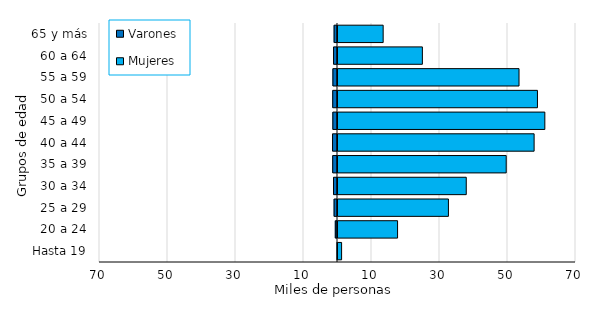
| Category | Varones | Mujeres |
|---|---|---|
| Hasta 19 | -102 | 1352 |
| 20 a 24 | -644 | 17815 |
| 25 a 29 | -1000 | 32773 |
| 30 a 34 | -1168 | 38016 |
| 35 a 39 | -1407 | 49768 |
| 40 a 44 | -1454 | 57976 |
| 45 a 49 | -1366 | 61128 |
| 50 a 54 | -1399 | 58961 |
| 55 a 59 | -1351 | 53535 |
| 60 a 64 | -1158 | 25114 |
| 65 y más | -997 | 13577 |